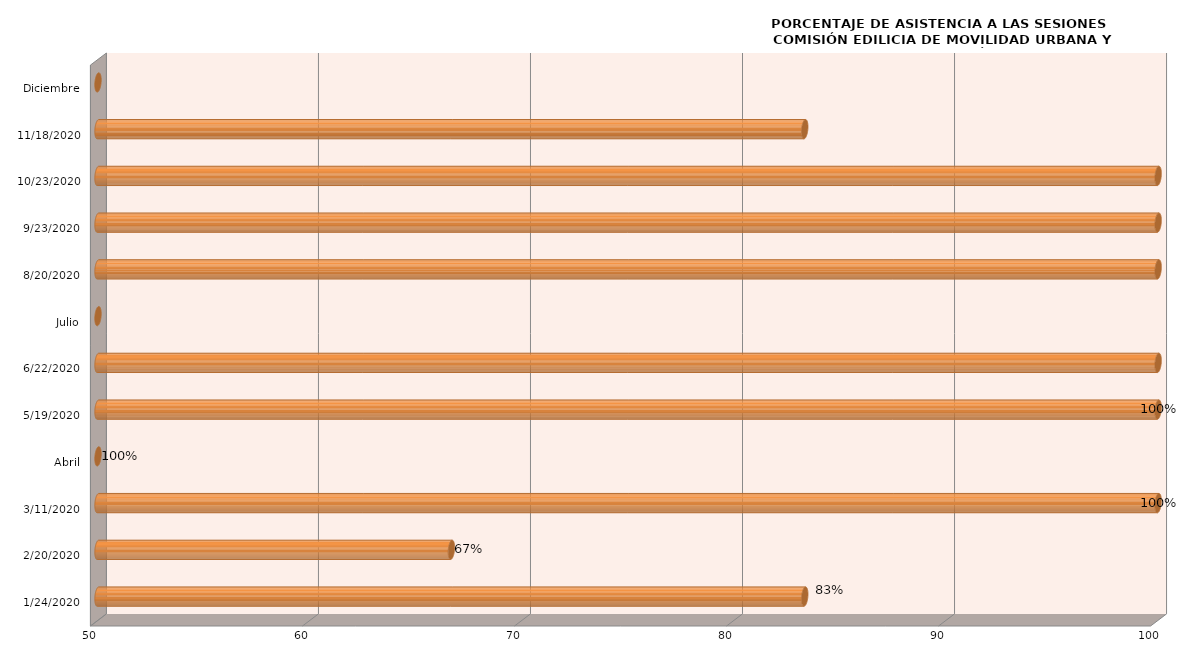
| Category | Series 0 |
|---|---|
| 24/01/2020 | 83.333 |
| 20/02/2020 | 66.667 |
| 11/03/2020 | 100 |
| Abril | 0 |
| 19/05/2020 | 100 |
| 22/06/2020 | 100 |
| Julio | 0 |
| 20/08/2020 | 100 |
| 23/09/2020 | 100 |
| 23/10/2020 | 100 |
| 18/11/2020 | 83.333 |
| Diciembre | 0 |